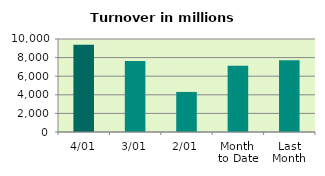
| Category | Series 0 |
|---|---|
| 4/01 | 9390.9 |
| 3/01 | 7640.864 |
| 2/01 | 4308.898 |
| Month 
to Date | 7113.554 |
| Last
Month | 7707.734 |